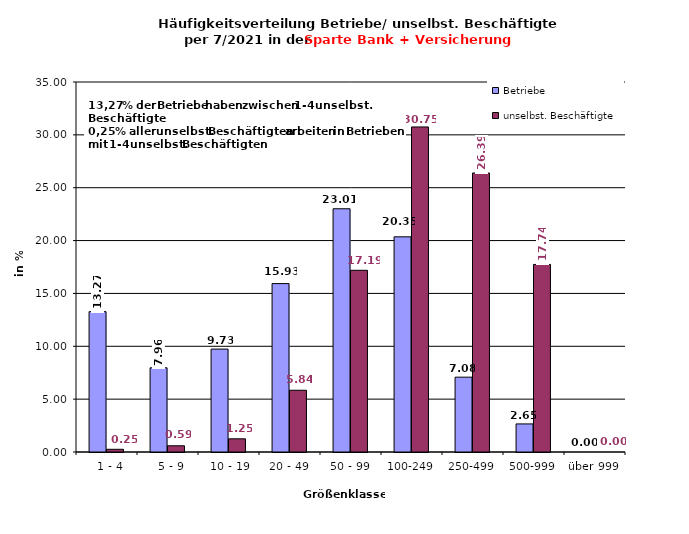
| Category | Betriebe | unselbst. Beschäftigte |
|---|---|---|
|   1 - 4 | 13.274 | 0.255 |
|   5 - 9 | 7.965 | 0.588 |
|  10 - 19 | 9.735 | 1.247 |
| 20 - 49 | 15.929 | 5.841 |
| 50 - 99 | 23.009 | 17.188 |
| 100-249 | 20.354 | 30.748 |
| 250-499 | 7.08 | 26.392 |
| 500-999 | 2.655 | 17.741 |
| über 999 | 0 | 0 |